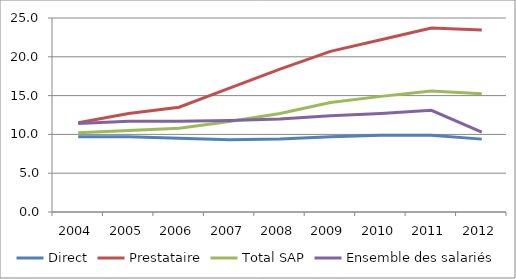
| Category | Direct | Prestataire | Total SAP | Ensemble des salariés |
|---|---|---|---|---|
| 2004.0 | 9.7 | 11.5 | 10.2 | 11.4 |
| 2005.0 | 9.7 | 12.7 | 10.5 | 11.7 |
| 2006.0 | 9.5 | 13.5 | 10.8 | 11.7 |
| 2007.0 | 9.319 | 15.951 | 11.651 | 11.796 |
| 2008.0 | 9.4 | 18.4 | 12.7 | 12 |
| 2009.0 | 9.7 | 20.7 | 14.1 | 12.4 |
| 2010.0 | 9.9 | 22.2 | 14.9 | 12.7 |
| 2011.0 | 9.9 | 23.7 | 15.6 | 13.1 |
| 2012.0 | 9.392 | 23.441 | 15.251 | 10.3 |